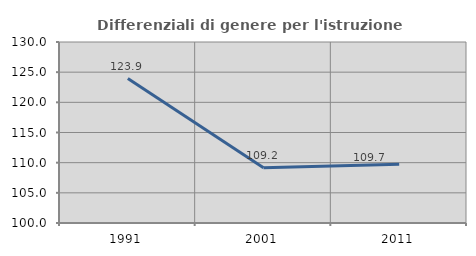
| Category | Differenziali di genere per l'istruzione superiore |
|---|---|
| 1991.0 | 123.948 |
| 2001.0 | 109.156 |
| 2011.0 | 109.734 |